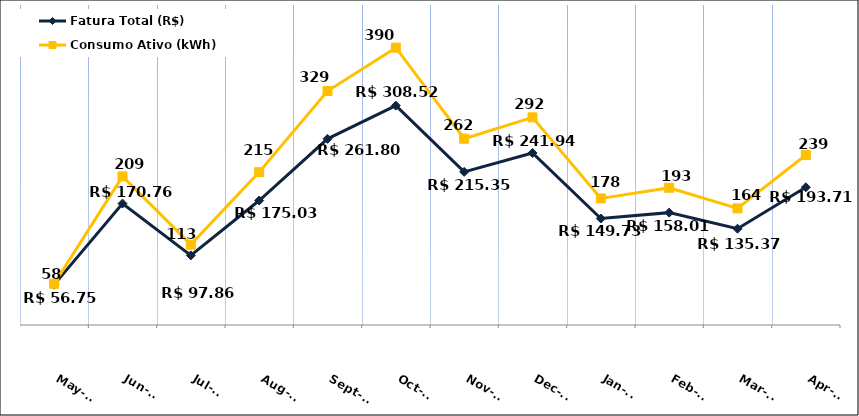
| Category | Fatura Total (R$) |
|---|---|
| 2023-05-01 | 56.75 |
| 2023-06-01 | 170.76 |
| 2023-07-01 | 97.86 |
| 2023-08-01 | 175.03 |
| 2023-09-01 | 261.8 |
| 2023-10-01 | 308.52 |
| 2023-11-01 | 215.35 |
| 2023-12-01 | 241.94 |
| 2024-01-01 | 149.73 |
| 2024-02-01 | 158.01 |
| 2024-03-01 | 135.37 |
| 2024-04-01 | 193.71 |